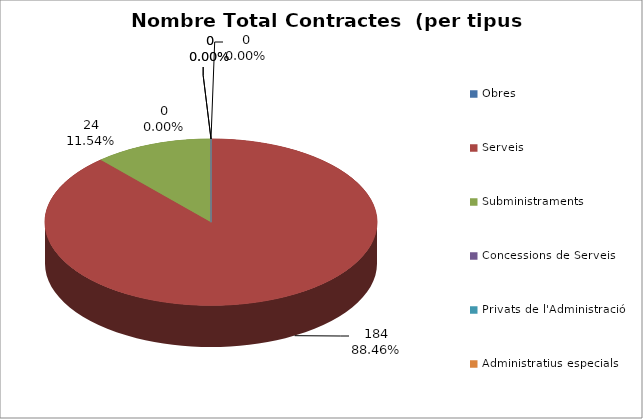
| Category | Nombre Total Contractes |
|---|---|
| Obres | 0 |
| Serveis | 184 |
| Subministraments | 24 |
| Concessions de Serveis | 0 |
| Privats de l'Administració | 0 |
| Administratius especials | 0 |